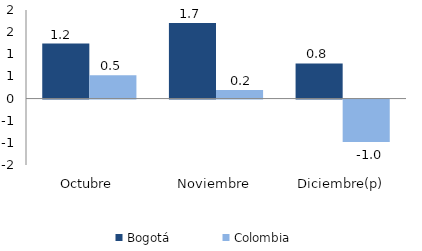
| Category | Bogotá | Colombia |
|---|---|---|
| Octubre | 1.242 | 0.524 |
| Noviembre | 1.705 | 0.191 |
| Diciembre(p) | 0.794 | -0.96 |